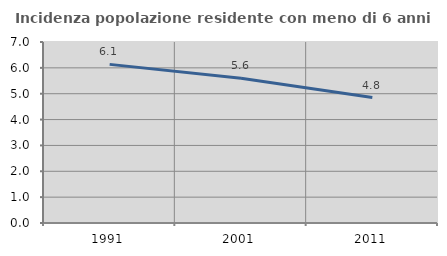
| Category | Incidenza popolazione residente con meno di 6 anni |
|---|---|
| 1991.0 | 6.134 |
| 2001.0 | 5.598 |
| 2011.0 | 4.849 |